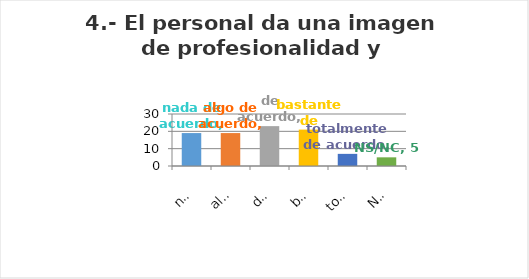
| Category | Series 0 |
|---|---|
| nada de acuerdo | 19 |
| algo de acuerdo | 19 |
| de acuerdo | 23 |
| bastante de acuerdo | 21 |
| totalmente de acuerdo | 7 |
| NS/NC | 5 |